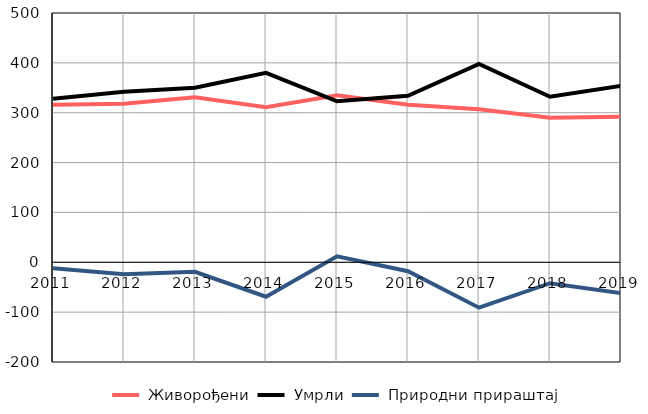
| Category |  Живорођени |  Умрли |  Природни прираштај |
|---|---|---|---|
| 2011.0 | 316 | 328 | -12 |
| 2012.0 | 318 | 342 | -24 |
| 2013.0 | 331 | 350 | -19 |
| 2014.0 | 311 | 380 | -69 |
| 2015.0 | 335 | 323 | 12 |
| 2016.0 | 316 | 334 | -18 |
| 2017.0 | 307 | 398 | -91 |
| 2018.0 | 290 | 332 | -42 |
| 2019.0 | 292 | 354 | -62 |